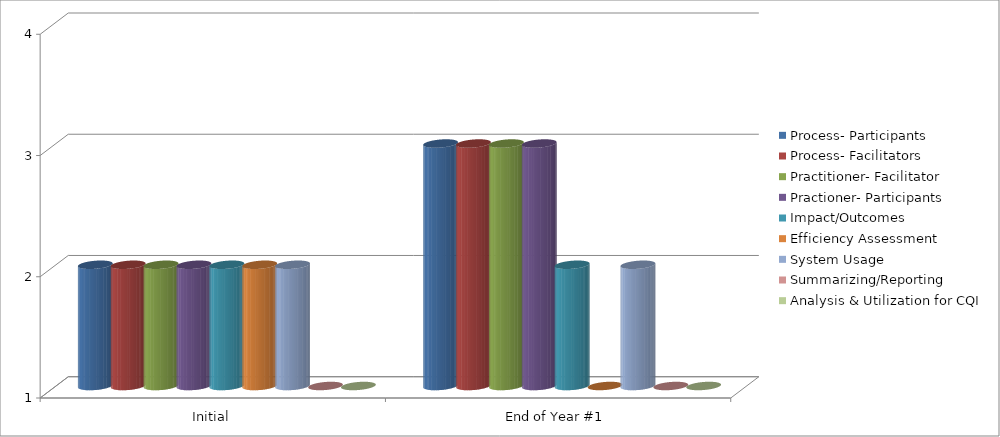
| Category | Process- Participants  | Process- Facilitators | Practitioner- Facilitator  | Practioner- Participants | Impact/Outcomes  | Efficiency Assessment  | System Usage  | Summarizing/Reporting | Analysis & Utilization for CQI |
|---|---|---|---|---|---|---|---|---|---|
| Initial | 2 | 2 | 2 | 2 | 2 | 2 | 2 | 1 | 1 |
| End of Year #1 | 3 | 3 | 3 | 3 | 2 | 1 | 2 | 1 | 1 |